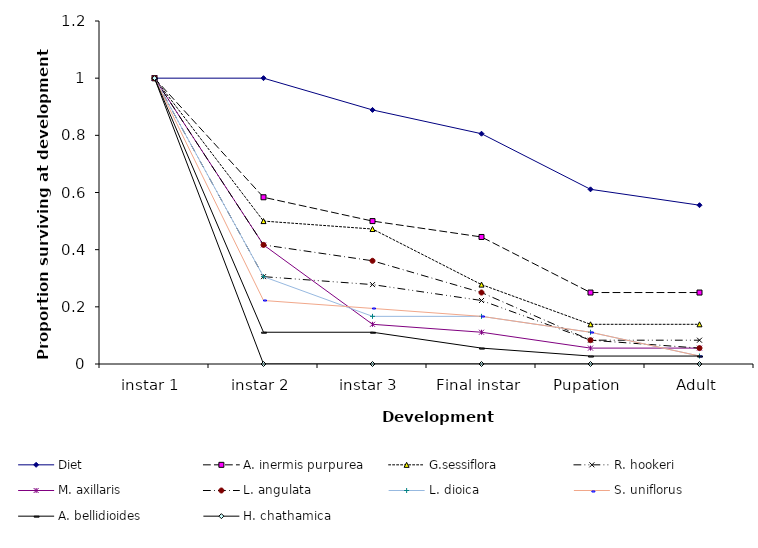
| Category | Diet | A. inermis purpurea | G.sessiflora | R. hookeri | M. axillaris | L. angulata | L. dioica | S. uniflorus | A. bellidioides | H. chathamica |
|---|---|---|---|---|---|---|---|---|---|---|
| instar 1 | 1 | 1 | 1 | 1 | 1 | 1 | 1 | 1 | 1 | 1 |
| instar 2 | 1 | 0.583 | 0.5 | 0.306 | 0.417 | 0.417 | 0.306 | 0.222 | 0.111 | 0 |
| instar 3 | 0.889 | 0.5 | 0.472 | 0.278 | 0.139 | 0.361 | 0.167 | 0.194 | 0.111 | 0 |
| Final instar | 0.806 | 0.444 | 0.278 | 0.222 | 0.111 | 0.25 | 0.167 | 0.167 | 0.056 | 0 |
| Pupation | 0.611 | 0.25 | 0.139 | 0.083 | 0.056 | 0.083 | 0.111 | 0.111 | 0.028 | 0 |
| Adult | 0.556 | 0.25 | 0.139 | 0.083 | 0.056 | 0.056 | 0.028 | 0.028 | 0.028 | 0 |